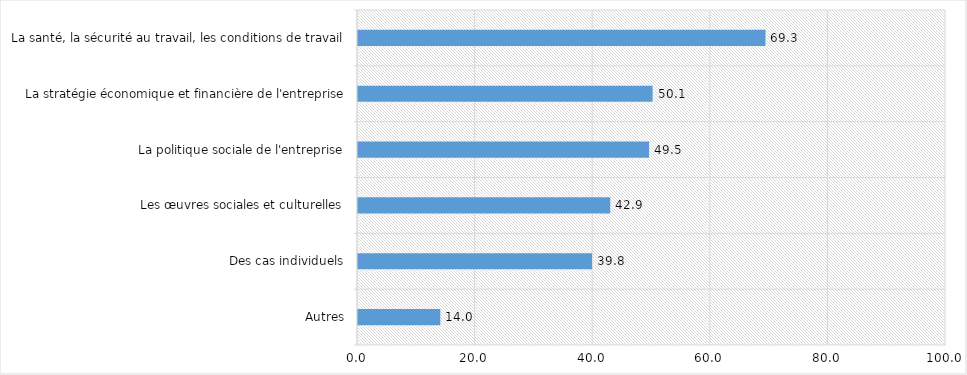
| Category | Series 0 |
|---|---|
| La santé, la sécurité au travail, les conditions de travail | 69.3 |
| La stratégie économique et financière de l'entreprise | 50.1 |
| La politique sociale de l'entreprise | 49.5 |
| Les œuvres sociales et culturelles | 42.9 |
| Des cas individuels | 39.8 |
| Autres | 14 |